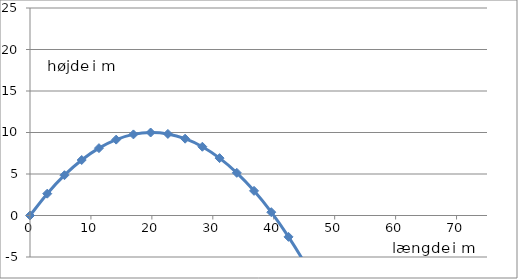
| Category | Series 0 |
|---|---|
| 0.0 | 0 |
| 2.8284271247461907 | 2.628 |
| 5.6568542494923815 | 4.857 |
| 8.48528137423857 | 6.685 |
| 11.313708498984763 | 8.114 |
| 14.142135623730951 | 9.142 |
| 16.97056274847714 | 9.771 |
| 19.79898987322333 | 9.999 |
| 22.627416997969526 | 9.827 |
| 25.455844122715714 | 9.256 |
| 28.284271247461902 | 8.284 |
| 31.112698372208097 | 6.913 |
| 33.94112549695428 | 5.141 |
| 36.76955262170048 | 2.97 |
| 39.59797974644666 | 0.398 |
| 42.42640687119285 | -2.574 |
| 45.25483399593905 | -5.945 |
| 48.083261120685236 | -9.717 |
| 50.91168824543143 | -13.888 |
| 53.74011537017761 | -18.46 |
| 56.568542494923804 | -23.431 |
| 59.39696961967 | -28.803 |
| 62.225396744416194 | -34.575 |
| 65.05382386916237 | -40.746 |
| 67.88225099390856 | -47.318 |
| 70.71067811865476 | -54.289 |
| 73.53910524340095 | -61.661 |
| 76.36753236814714 | -69.432 |
| 79.19595949289332 | -77.604 |
| 82.02438661763951 | -86.176 |
| 84.8528137423857 | -95.147 |
| 87.68124086713189 | -104.519 |
| 90.5096679918781 | -114.29 |
| 93.33809511662426 | -124.462 |